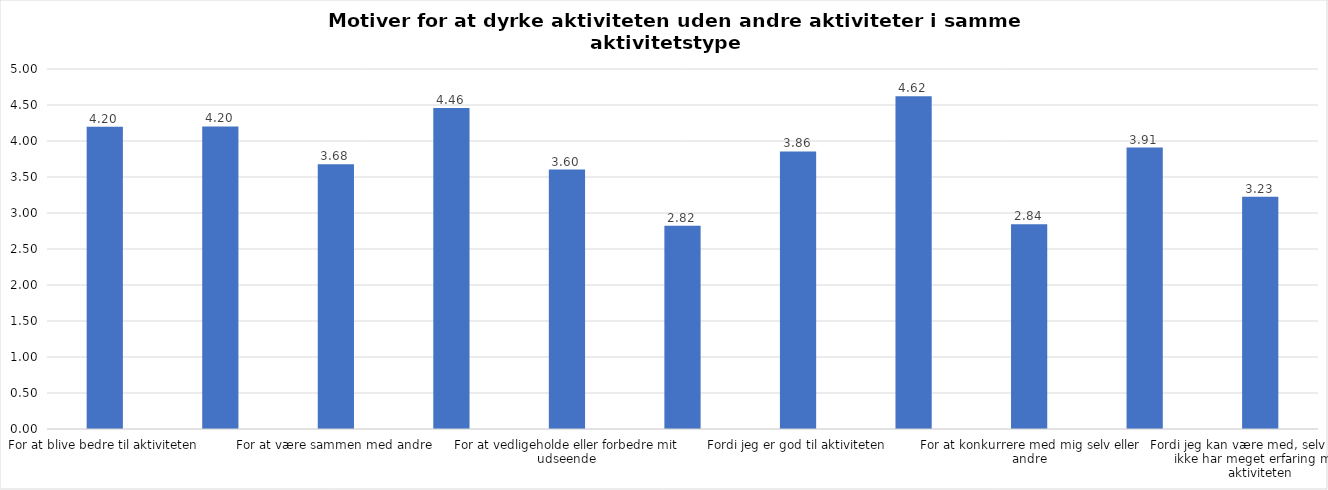
| Category | Gennemsnit |
|---|---|
| For at blive bedre til aktiviteten | 4.198 |
| For at vedligeholde eller forbedre min sundhed (fx helbred, fysisk form) | 4.202 |
| For at være sammen med andre | 3.678 |
| For at gøre noget godt for mig selv | 4.459 |
| For at vedligeholde eller forbedre mit udseende | 3.603 |
| Fordi andre i min omgangskreds opmuntrer mig til det | 2.822 |
| Fordi jeg er god til aktiviteten | 3.855 |
| Fordi jeg godt kan lide aktiviteten | 4.62 |
| For at konkurrere med mig selv eller andre | 2.843 |
| Fordi aktiviteten passer godt ind i min hverdag | 3.909 |
| Fordi jeg kan være med, selv om jeg ikke har meget erfaring med aktiviteten | 3.227 |